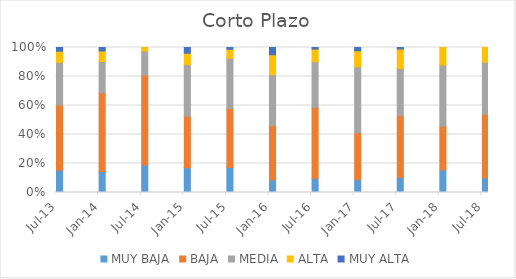
| Category | MUY BAJA | BAJA | MEDIA | ALTA | MUY ALTA |
|---|---|---|---|---|---|
| 2013-07-01 | 0.154 | 0.449 | 0.295 | 0.077 | 0.026 |
| 2014-01-01 | 0.145 | 0.542 | 0.217 | 0.072 | 0.024 |
| 2014-07-01 | 0.19 | 0.619 | 0.167 | 0.024 | 0 |
| 2015-01-01 | 0.171 | 0.355 | 0.355 | 0.079 | 0.039 |
| 2015-07-01 | 0.173 | 0.407 | 0.346 | 0.062 | 0.012 |
| 2016-01-01 | 0.088 | 0.375 | 0.35 | 0.138 | 0.05 |
| 2016-07-01 | 0.098 | 0.489 | 0.315 | 0.087 | 0.011 |
| 2017-01-01 | 0.089 | 0.322 | 0.456 | 0.111 | 0.022 |
| 2017-07-01 | 0.104 | 0.427 | 0.323 | 0.135 | 0.01 |
| 2018-01-01 | 0.157 | 0.301 | 0.422 | 0.12 | 0 |
| 2018-07-01 | 0.101 | 0.438 | 0.36 | 0.101 | 0 |